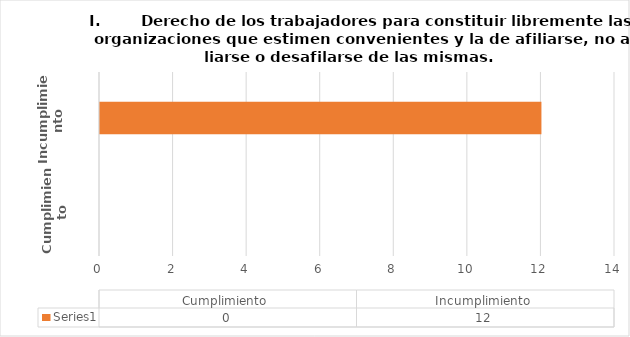
| Category | Series 0 |
|---|---|
| Cumplimiento  | 0 |
| Incumplimiento  | 12 |